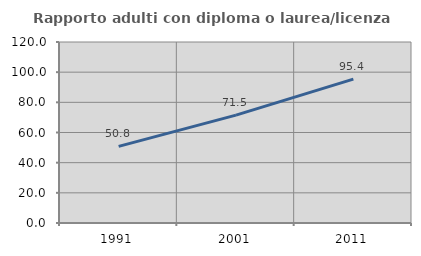
| Category | Rapporto adulti con diploma o laurea/licenza media  |
|---|---|
| 1991.0 | 50.794 |
| 2001.0 | 71.538 |
| 2011.0 | 95.373 |